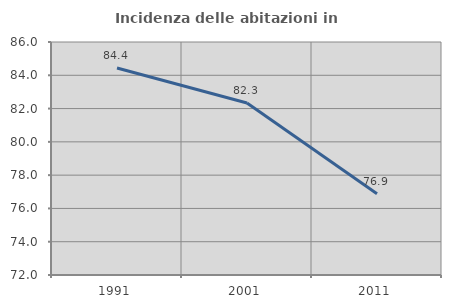
| Category | Incidenza delle abitazioni in proprietà  |
|---|---|
| 1991.0 | 84.437 |
| 2001.0 | 82.335 |
| 2011.0 | 76.879 |